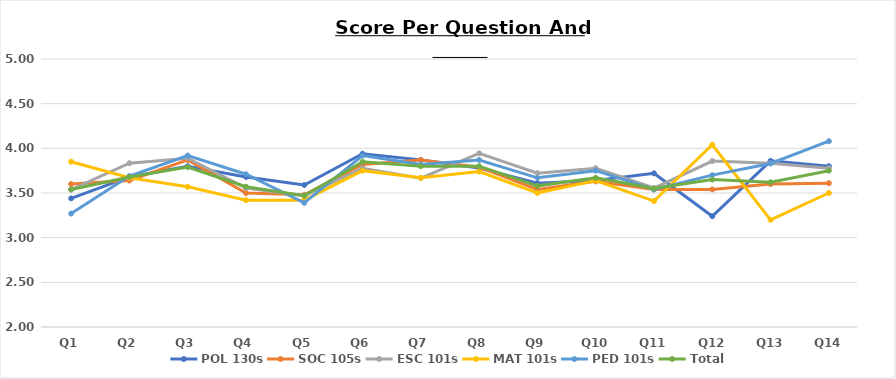
| Category | POL 130s | SOC 105s | ESC 101s | MAT 101s | PED 101s | Total |
|---|---|---|---|---|---|---|
| Q1 | 3.44 | 3.6 | 3.538 | 3.85 | 3.27 | 3.54 |
| Q2 | 3.68 | 3.64 | 3.833 | 3.67 | 3.69 | 3.68 |
| Q3 | 3.8 | 3.87 | 3.889 | 3.57 | 3.92 | 3.79 |
| Q4 | 3.68 | 3.5 | 3.556 | 3.42 | 3.71 | 3.57 |
| Q5 | 3.59 | 3.48 | 3.471 | 3.42 | 3.39 | 3.47 |
| Q6 | 3.94 | 3.82 | 3.778 | 3.75 | 3.92 | 3.85 |
| Q7 | 3.87 | 3.87 | 3.667 | 3.67 | 3.82 | 3.8 |
| Q8 | 3.78 | 3.79 | 3.944 | 3.74 | 3.87 | 3.8 |
| Q9 | 3.61 | 3.54 | 3.722 | 3.5 | 3.67 | 3.58 |
| Q10 | 3.64 | 3.63 | 3.778 | 3.64 | 3.75 | 3.67 |
| Q11 | 3.72 | 3.54 | 3.556 | 3.41 | 3.54 | 3.55 |
| Q12 | 3.24 | 3.54 | 3.857 | 4.04 | 3.7 | 3.65 |
| Q13 | 3.86 | 3.6 | 3.833 | 3.2 | 3.83 | 3.62 |
| Q14 | 3.8 | 3.61 | 3.778 | 3.5 | 4.08 | 3.75 |